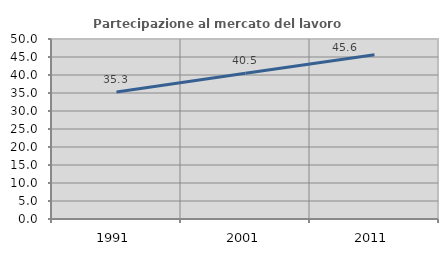
| Category | Partecipazione al mercato del lavoro  femminile |
|---|---|
| 1991.0 | 35.286 |
| 2001.0 | 40.46 |
| 2011.0 | 45.646 |